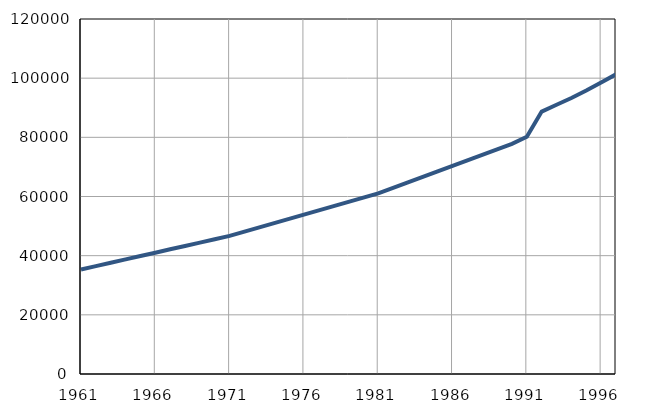
| Category | Број
становника |
|---|---|
| 1961.0 | 35346 |
| 1962.0 | 36479 |
| 1963.0 | 37612 |
| 1964.0 | 38745 |
| 1965.0 | 39878 |
| 1966.0 | 41011 |
| 1967.0 | 42144 |
| 1968.0 | 43277 |
| 1969.0 | 44410 |
| 1970.0 | 45543 |
| 1971.0 | 46680 |
| 1972.0 | 48117 |
| 1973.0 | 49554 |
| 1974.0 | 50991 |
| 1975.0 | 52428 |
| 1976.0 | 53865 |
| 1977.0 | 55302 |
| 1978.0 | 56739 |
| 1979.0 | 58176 |
| 1980.0 | 59613 |
| 1981.0 | 61045 |
| 1982.0 | 62908 |
| 1983.0 | 64771 |
| 1984.0 | 66634 |
| 1985.0 | 68497 |
| 1986.0 | 70360 |
| 1987.0 | 72223 |
| 1988.0 | 74086 |
| 1989.0 | 75949 |
| 1990.0 | 77812 |
| 1991.0 | 80200 |
| 1992.0 | 88700 |
| 1993.0 | 91000 |
| 1994.0 | 93300 |
| 1995.0 | 95800 |
| 1996.0 | 98500 |
| 1997.0 | 101300 |